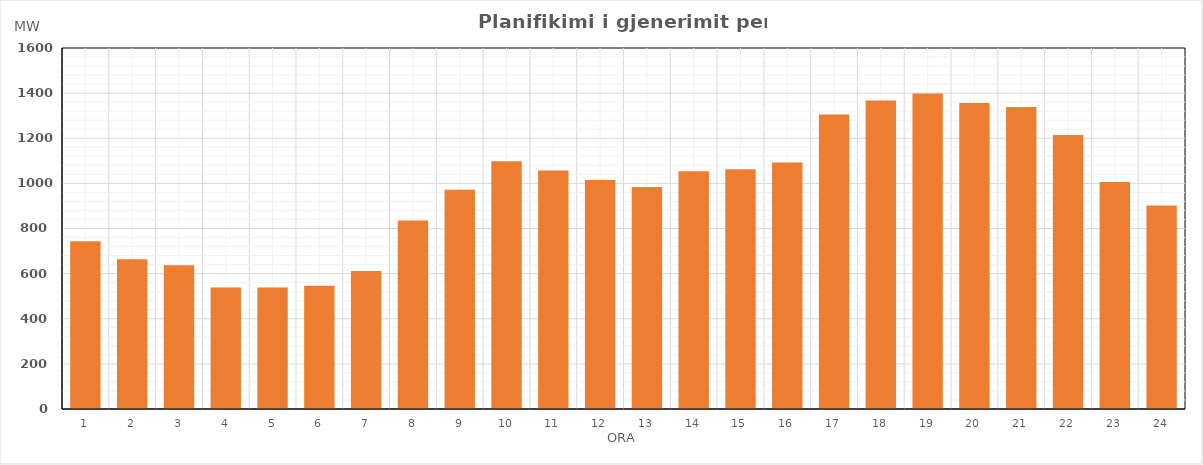
| Category | Max (MW) |
|---|---|
| 0 | 743.782 |
| 1 | 663.916 |
| 2 | 636.873 |
| 3 | 538.826 |
| 4 | 538.982 |
| 5 | 545.779 |
| 6 | 611.719 |
| 7 | 835.383 |
| 8 | 971.452 |
| 9 | 1097.526 |
| 10 | 1057.521 |
| 11 | 1014.818 |
| 12 | 984.318 |
| 13 | 1053.894 |
| 14 | 1063.087 |
| 15 | 1092.187 |
| 16 | 1305.06 |
| 17 | 1367.069 |
| 18 | 1398.527 |
| 19 | 1356.47 |
| 20 | 1338.871 |
| 21 | 1214.584 |
| 22 | 1005.829 |
| 23 | 902.292 |